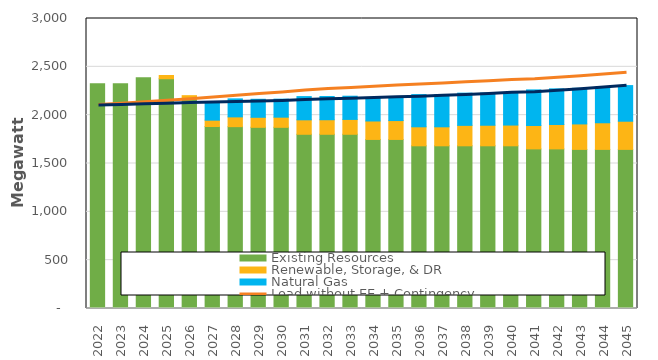
| Category | Existing Resources | Renewable, Storage, & DR | Natural Gas |
|---|---|---|---|
| 2022.0 | 2325.674 | 0 | 0 |
| 2023.0 | 2324.47 | 0 | 0 |
| 2024.0 | 2387.518 | 0 | 0 |
| 2025.0 | 2376.677 | 33.861 | 0 |
| 2026.0 | 2166.528 | 35.169 | 0 |
| 2027.0 | 1882.479 | 65.761 | 186.388 |
| 2028.0 | 1881.233 | 101.032 | 186.388 |
| 2029.0 | 1874.196 | 103.833 | 186.388 |
| 2030.0 | 1874.28 | 104.932 | 186.388 |
| 2031.0 | 1802.223 | 149.779 | 240.131 |
| 2032.0 | 1802.263 | 150.569 | 240.131 |
| 2033.0 | 1802.302 | 153.648 | 240.131 |
| 2034.0 | 1748.942 | 190.817 | 240.131 |
| 2035.0 | 1748.982 | 195.105 | 240.131 |
| 2036.0 | 1683.022 | 196.618 | 333.339 |
| 2037.0 | 1683.062 | 196.506 | 333.339 |
| 2038.0 | 1683.101 | 211.36 | 333.339 |
| 2039.0 | 1683.141 | 212.562 | 333.339 |
| 2040.0 | 1683.181 | 214.485 | 333.339 |
| 2041.0 | 1651.121 | 241.709 | 368.647 |
| 2042.0 | 1651.161 | 252.374 | 368.647 |
| 2043.0 | 1645.94 | 263.395 | 368.647 |
| 2044.0 | 1645.98 | 275.374 | 368.647 |
| 2045.0 | 1646.02 | 291.308 | 368.647 |